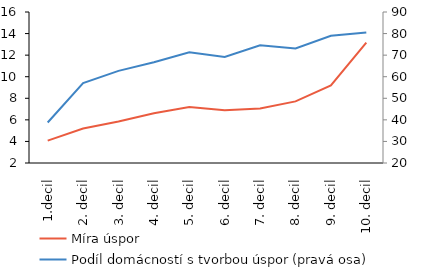
| Category | Míra úspor |
|---|---|
| 0 | 4.076 |
| 1 | 5.203 |
| 2 | 5.846 |
| 3 | 6.613 |
| 4 | 7.192 |
| 5 | 6.89 |
| 6 | 7.059 |
| 7 | 7.71 |
| 8 | 9.191 |
| 9 | 13.159 |